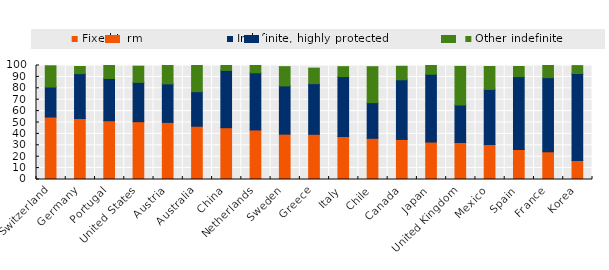
| Category | Fixed-term  | Indefinite, highly protected | Other indefinite |
|---|---|---|---|
| Switzerland | 54.795 | 26.291 | 18.673 |
| Germany | 53.493 | 39.399 | 6.224 |
| Portugal | 51.57 | 37.074 | 11.357 |
| United States | 50.731 | 34.495 | 14.212 |
| Austria | 50.105 | 33.801 | 16.095 |
| Australia | 46.712 | 30.335 | 22.952 |
| China | 45.441 | 50.271 | 4.288 |
| Netherlands | 43.46 | 50.147 | 6.394 |
| Sweden | 39.79 | 42.309 | 16.892 |
| Greece | 39.684 | 44.373 | 13.638 |
| Italy | 37.722 | 52.554 | 8.708 |
| Chile | 36.136 | 31.275 | 31.519 |
| Canada | 35.164 | 52.303 | 11.836 |
| Japan | 32.87 | 59.497 | 7.634 |
| United Kingdom | 32.483 | 32.865 | 33.865 |
| Mexico | 30.72 | 48.344 | 20.087 |
| Spain | 26.356 | 63.862 | 8.928 |
| France | 24.32 | 65.021 | 10.66 |
| Korea | 16.69 | 76.312 | 6.889 |